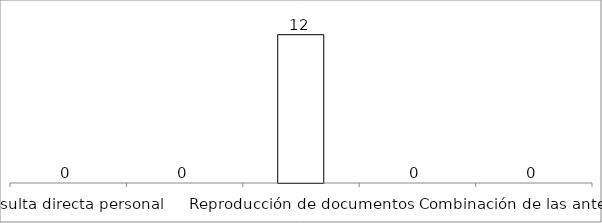
| Category | Series 0 |
|---|---|
| Consulta directa personal | 0 |
| Consulta directa electrónica | 0 |
| Reproducción de documentos | 12 |
| Elaboración de informes | 0 |
| Combinación de las anteriores | 0 |